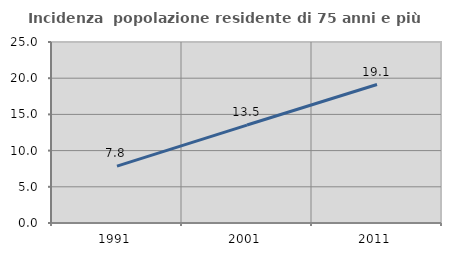
| Category | Incidenza  popolazione residente di 75 anni e più |
|---|---|
| 1991.0 | 7.846 |
| 2001.0 | 13.528 |
| 2011.0 | 19.125 |